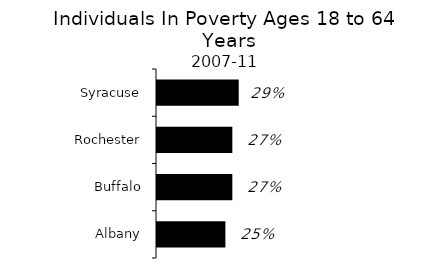
| Category | Series 0 |
|---|---|
| Albany | 0.246 |
| Buffalo | 0.271 |
| Rochester | 0.271 |
| Syracuse | 0.294 |